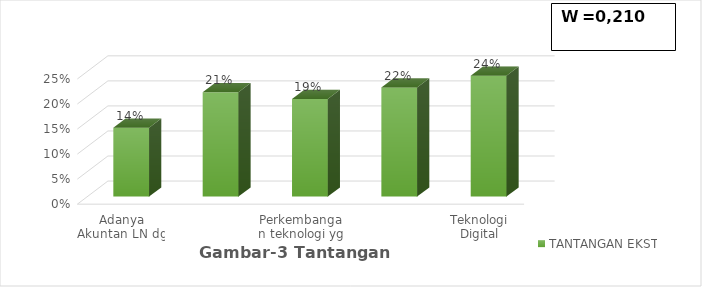
| Category | TANTANGAN EKSTERN |
|---|---|
| Adanya Akuntan LN dg keahlian yg mumpuni | 0.138 |
| Era big data lebih dominan | 0.209 |
| Perkembangan teknologi yg tdk  mudah di prediksi | 0.195 |
| Teknologi digital masuk dlm ranah akuntansi | 0.218 |
| Teknologi Digital semakin Canggih | 0.241 |